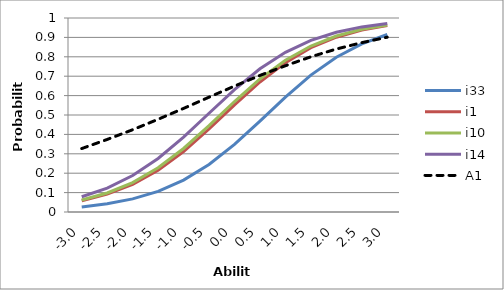
| Category | i33 | i1 | i10 | i14 | A1 |
|---|---|---|---|---|---|
| -3.0 | 0.026 | 0.058 | 0.062 | 0.078 | 0.327 |
| -2.5 | 0.042 | 0.092 | 0.098 | 0.123 | 0.374 |
| -2.0 | 0.067 | 0.143 | 0.152 | 0.188 | 0.424 |
| -1.5 | 0.107 | 0.216 | 0.228 | 0.276 | 0.478 |
| -1.0 | 0.164 | 0.312 | 0.327 | 0.386 | 0.534 |
| -0.5 | 0.245 | 0.428 | 0.445 | 0.509 | 0.592 |
| 0.0 | 0.348 | 0.552 | 0.57 | 0.631 | 0.649 |
| 0.5 | 0.469 | 0.67 | 0.686 | 0.738 | 0.704 |
| 1.0 | 0.592 | 0.77 | 0.782 | 0.823 | 0.754 |
| 1.5 | 0.706 | 0.847 | 0.856 | 0.885 | 0.8 |
| 2.0 | 0.798 | 0.901 | 0.907 | 0.927 | 0.84 |
| 2.5 | 0.867 | 0.938 | 0.942 | 0.954 | 0.873 |
| 3.0 | 0.915 | 0.961 | 0.964 | 0.972 | 0.901 |